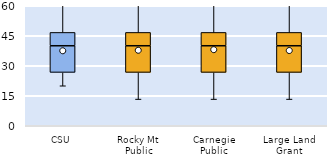
| Category | 25th | 50th | 75th |
|---|---|---|---|
| CSU | 26.667 | 13.333 | 6.667 |
| Rocky Mt Public | 26.667 | 13.333 | 6.667 |
| Carnegie Public | 26.667 | 13.333 | 6.667 |
| Large Land Grant | 26.667 | 13.333 | 6.667 |